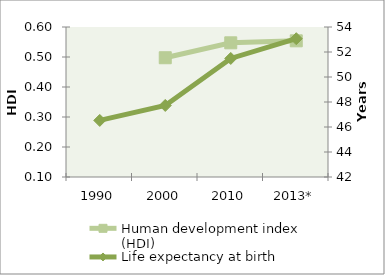
| Category | Human development index (HDI) |
|---|---|
| 1990 | 0 |
| 2000 | 0.498 |
| 2010 | 0.547 |
| 2013* | 0.554 |